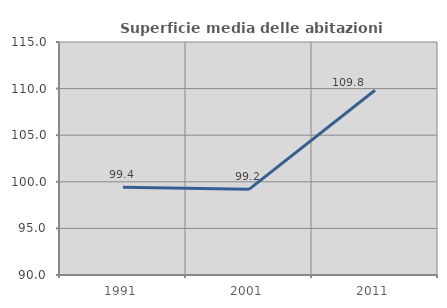
| Category | Superficie media delle abitazioni occupate |
|---|---|
| 1991.0 | 99.408 |
| 2001.0 | 99.187 |
| 2011.0 | 109.821 |